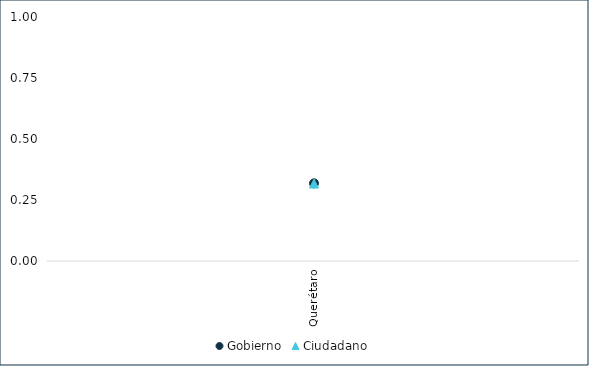
| Category | Gobierno | Ciudadano |
|---|---|---|
| Querétaro | 0.318 | 0.317 |